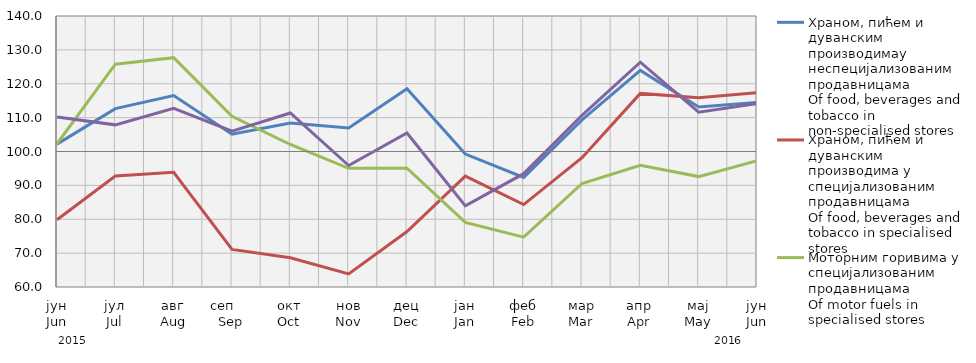
| Category | Храном, пићем и дуванским производимау неспецијализованим продавницама
Of food, beverages and tobacco in non-specialised stores
 | Храном, пићем и дуванским производима у специјализовaним продавницама
Оf food, beverages and tobacco in specialised stores | Моторним горивима у специјализованим продавницама
Of motor fuels in specialised stores | Остала
Other |
|---|---|---|---|---|
| јун
Jun | 102.183 | 79.832 | 102.276 | 110.183 |
| јул
Jul | 112.664 | 92.74 | 125.76 | 107.864 |
| авг
Aug | 116.519 | 93.864 | 127.707 | 112.769 |
| сеп     Sep | 105.123 | 71.088 | 110.411 | 106.02 |
| окт
Oct | 108.393 | 68.621 | 102.068 | 111.365 |
| нов
Nov | 106.938 | 63.847 | 95.032 | 95.869 |
| дец
Dec | 118.498 | 76.368 | 95.084 | 105.475 |
| јан
Jan | 99.255 | 92.722 | 79.068 | 83.94 |
| феб
Feb | 92.363 | 84.339 | 74.7 | 93.451 |
| мар
Mar | 109.349 | 98.183 | 90.564 | 110.695 |
| апр
Apr | 123.935 | 117.147 | 95.897 | 126.373 |
| мај
May | 113.15 | 115.884 | 92.592 | 111.621 |
| јун
Jun | 114.503 | 117.373 | 97.274 | 114.134 |